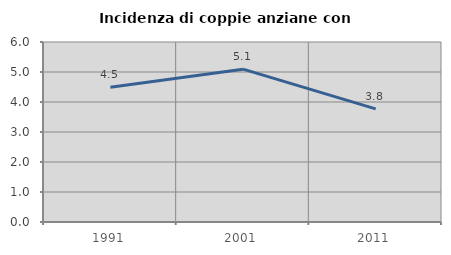
| Category | Incidenza di coppie anziane con figli |
|---|---|
| 1991.0 | 4.491 |
| 2001.0 | 5.094 |
| 2011.0 | 3.769 |